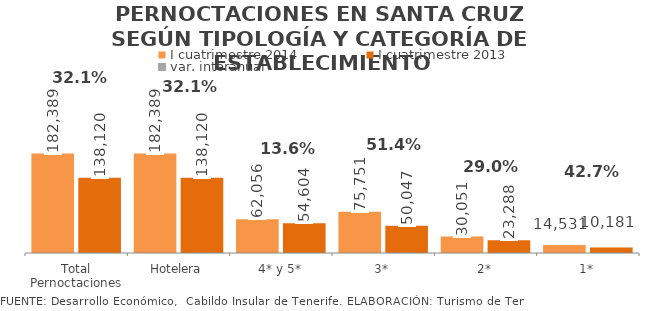
| Category | I cuatrimestre 2014 | I cuatrimestre 2013 |
|---|---|---|
| Total Pernoctaciones | 182389 | 138120 |
| Hotelera | 182389 | 138120 |
| 4* y 5* | 62056 | 54604 |
| 3* | 75751 | 50047 |
| 2* | 30051 | 23288 |
| 1* | 14531 | 10181 |